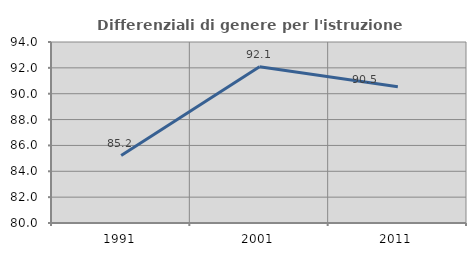
| Category | Differenziali di genere per l'istruzione superiore |
|---|---|
| 1991.0 | 85.218 |
| 2001.0 | 92.078 |
| 2011.0 | 90.538 |